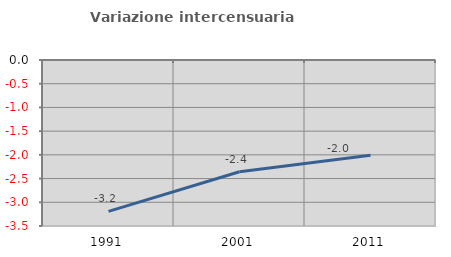
| Category | Variazione intercensuaria annua |
|---|---|
| 1991.0 | -3.192 |
| 2001.0 | -2.356 |
| 2011.0 | -2.009 |